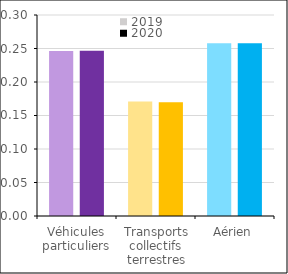
| Category | 2019 | 2020 |
|---|---|---|
| Véhicules particuliers | 0.246 | 0.247 |
| Transports collectifs terrestres | 0.171 | 0.17 |
| Aérien | 0.258 | 0.258 |